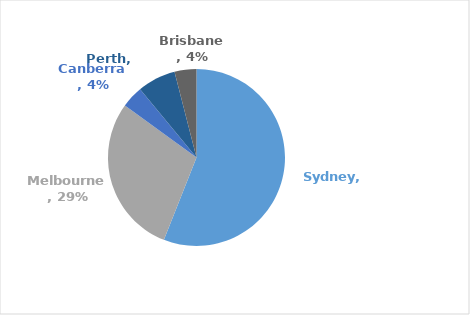
| Category | Series 0 |
|---|---|
| Sydney | 0.56 |
| Melbourne | 0.29 |
| Canberra | 0.04 |
| Perth | 0.07 |
| Brisbane | 0.04 |